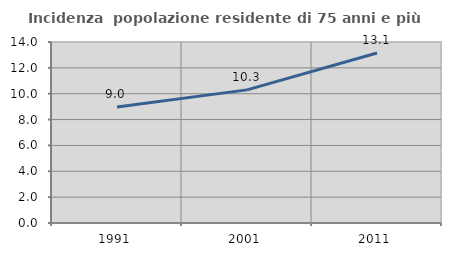
| Category | Incidenza  popolazione residente di 75 anni e più |
|---|---|
| 1991.0 | 8.98 |
| 2001.0 | 10.296 |
| 2011.0 | 13.146 |